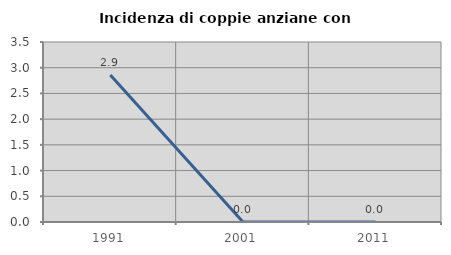
| Category | Incidenza di coppie anziane con figli |
|---|---|
| 1991.0 | 2.857 |
| 2001.0 | 0 |
| 2011.0 | 0 |